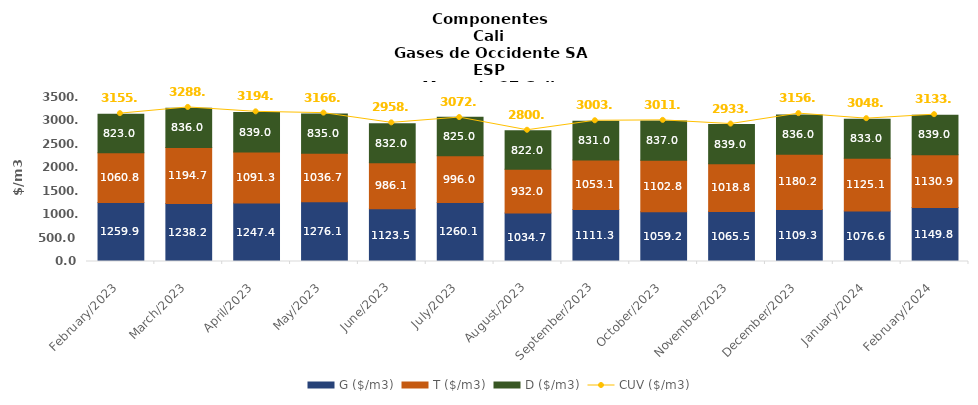
| Category | G ($/m3) | T ($/m3) | D ($/m3) |
|---|---|---|---|
| 2023-02-01 | 1259.91 | 1060.8 | 823 |
| 2023-03-01 | 1238.18 | 1194.68 | 836 |
| 2023-04-01 | 1247.38 | 1091.29 | 839 |
| 2023-05-01 | 1276.06 | 1036.67 | 835 |
| 2023-06-01 | 1123.54 | 986.08 | 832 |
| 2023-07-01 | 1260.12 | 995.95 | 825 |
| 2023-08-01 | 1034.65 | 931.99 | 822 |
| 2023-09-01 | 1111.32 | 1053.08 | 831 |
| 2023-10-01 | 1059.24 | 1102.78 | 837 |
| 2023-11-01 | 1065.48 | 1018.81 | 839 |
| 2023-12-01 | 1109.29 | 1180.21 | 836 |
| 2024-01-01 | 1076.64 | 1125.08 | 833 |
| 2024-02-01 | 1149.84 | 1130.93 | 839 |